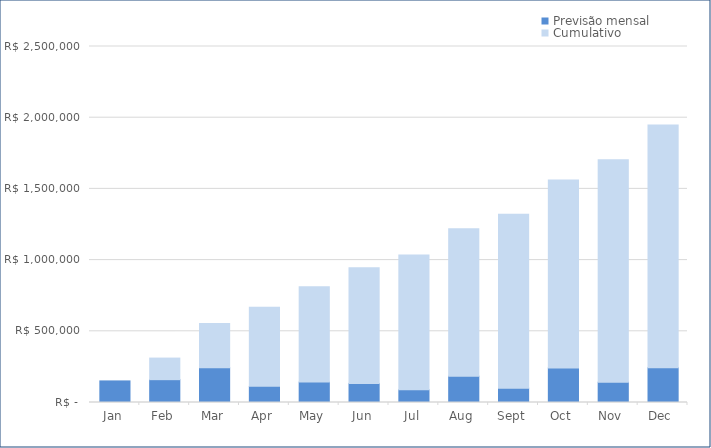
| Category | Previsão mensal | Cumulativo |
|---|---|---|
| 2020-01-01 | 151600 | 0 |
| 2020-02-01 | 160320 | 151600 |
| 2020-03-01 | 243500 | 311920 |
| 2020-04-01 | 113450 | 555420 |
| 2020-05-01 | 143200 | 668870 |
| 2020-06-01 | 134000 | 812070 |
| 2020-07-01 | 89400 | 946070 |
| 2020-08-01 | 184900 | 1035470 |
| 2020-09-01 | 100800 | 1220370 |
| 2020-10-01 | 241850 | 1321170 |
| 2020-11-01 | 142425 | 1563020 |
| 2020-12-01 | 243400 | 1705445 |